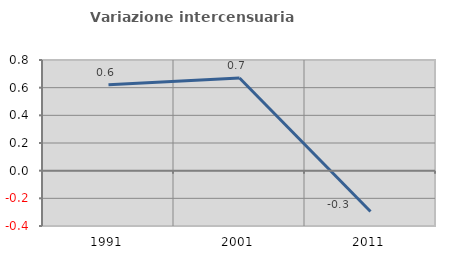
| Category | Variazione intercensuaria annua |
|---|---|
| 1991.0 | 0.622 |
| 2001.0 | 0.67 |
| 2011.0 | -0.295 |